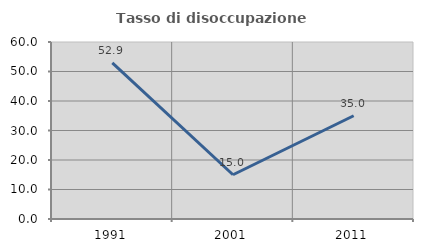
| Category | Tasso di disoccupazione giovanile  |
|---|---|
| 1991.0 | 52.941 |
| 2001.0 | 15 |
| 2011.0 | 35 |